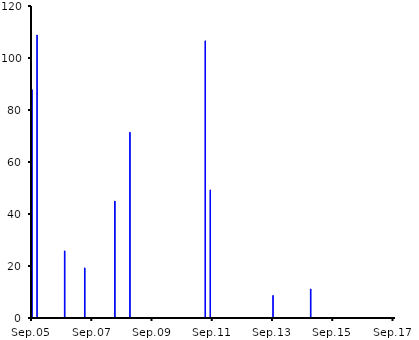
| Category | Interrupción de disponibilidad del sistema LBTR (minutos) |
|---|---|
| Sep.05 | 87.822 |
| Oct.05 | 0 |
| Nov.05 | 108.834 |
| Dic.05 | 0 |
| Ene.06 | 0 |
| Feb.06 | 0 |
| Mar.06 | 0 |
| Abr.06 | 0 |
| May.06 | 0 |
| Jun.06 | 0 |
| Jul.06 | 0 |
| Ago.06 | 0 |
| Sep.06 | 0 |
| Oct.06 | 25.806 |
| Nov.06 | 0 |
| Dic.06 | 0 |
| Ene.07 | 0 |
| Feb.07 | 0 |
| Mar.07 | 0 |
| Abr.07 | 0 |
| May.07 | 0 |
| Jun.07 | 19.278 |
| Jul.07 | 0 |
| Ago.07 | 0 |
| Sep.07 | 0 |
| Oct.07 | 0 |
| Nov.07 | 0 |
| Dic.07 | 0 |
| Ene.08 | 0 |
| Feb.08 | 0 |
| Mar.08 | 0 |
| Abr.08 | 0 |
| May.08 | 0 |
| Jun.08 | 44.982 |
| Jul.08 | 0 |
| Ago.08 | 0 |
| Sep.08 | 0 |
| Oct.08 | 0 |
| Nov.08 | 0 |
| Dic.08 | 71.424 |
| Ene.09 | 0 |
| Feb.09 | 0 |
| Mar.09 | 0 |
| Abr.09 | 0 |
| May.09 | 0 |
| Jun.09 | 0 |
| Jul.09 | 0 |
| Ago.09 | 0 |
| Sep.09 | 0 |
| Oct.09 | 0 |
| Nov.09 | 0 |
| Dic.09 | 0 |
| Ene.10 | 0 |
| Feb.10 | 0 |
| Mar.10 | 0 |
| Abr.10 | 0 |
| May.10 | 0 |
| Jun.10 | 0 |
| Jul.10 | 0 |
| Ago.10 | 0 |
| Sep.10 | 0 |
| Oct.10 | 0 |
| Nov.10 | 0 |
| Dic.10 | 0 |
| Ene.11 | 0 |
| Feb.11 | 0 |
| Mar.11 | 0 |
| Abr.11 | 0 |
| May.11 | 0 |
| Jun.11 | 106.59 |
| Jul.11 | 0 |
| Ago.11 | 49.266 |
| Sep.11 | 0 |
| Oct.11 | 0 |
| Nov.11 | 0 |
| Dic.11 | 0 |
| Ene.12 | 0 |
| Feb.12 | 0 |
| Mar.12 | 0 |
| Abr.12 | 0 |
| May.12 | 0 |
| Jun.12 | 0 |
| Jul.12 | 0 |
| Ago.12 | 0 |
| Sep.12 | 0 |
| Oct.12 | 0 |
| Nov.12 | 0 |
| Dic.12 | 0 |
| Ene.13 | 0 |
| Feb.13 | 0 |
| Mar.13 | 0 |
| Abr.13 | 0 |
| May.13 | 0 |
| Jun.13 | 0 |
| Jul.13 | 0 |
| Ago.13 | 0 |
| Sep.13 | 8.667 |
| Oct.13 | 0 |
| Nov.13 | 0 |
| Dic.13 | 0 |
| Ene.14 | 0 |
| Feb.14 | 0 |
| Mar.14 | 0 |
| Abr.14 | 0 |
| May.14 | 0 |
| Jun.14 | 0 |
| Jul.14 | 0 |
| Ago.14 | 0 |
| Sep.14 | 0 |
| Oct.14 | 0 |
| Nov.14 | 0 |
| Dic.14 | 11.16 |
| Ene.15 | 0 |
| Feb.15 | 0 |
| Mar.15 | 0 |
| Abr.15 | 0 |
| May.15 | 0 |
| Jun.15 | 0 |
| Jul.15 | 0 |
| Ago.15 | 0 |
| Sep.15 | 0 |
| Oct.15 | 0 |
| Nov.15 | 0 |
| Dic.15 | 0 |
| Ene.16 | 0 |
| Feb.16 | 0 |
| Mar.16 | 0 |
| Abr.16 | 0 |
| May.16 | 0 |
| Jun.16 | 0 |
| Jul.16 | 0 |
| Ago.16 | 0 |
| Sep.16 | 0 |
| Oct.16 | 0 |
| Nov.16 | 0 |
| Dic.16 | 0 |
| Ene.17 | 0 |
| Feb.17 | 0 |
| Mar.17 | 0 |
| Abr.17 | 0 |
| May.17 | 0 |
| Jun.17 | 0 |
| Jul.17 | 0 |
| Ago.17 | 0 |
| Sep.17 | 0 |